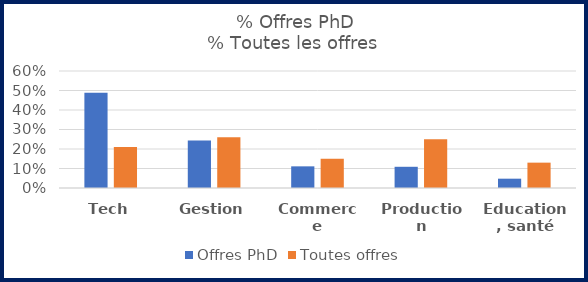
| Category | Offres PhD | Toutes offres |
|---|---|---|
| Tech | 0.489 | 0.21 |
| Gestion | 0.244 | 0.26 |
| Commerce | 0.111 | 0.15 |
| Production | 0.109 | 0.25 |
| Education, santé | 0.048 | 0.13 |